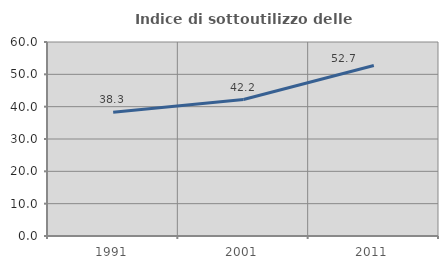
| Category | Indice di sottoutilizzo delle abitazioni  |
|---|---|
| 1991.0 | 38.308 |
| 2001.0 | 42.207 |
| 2011.0 | 52.727 |